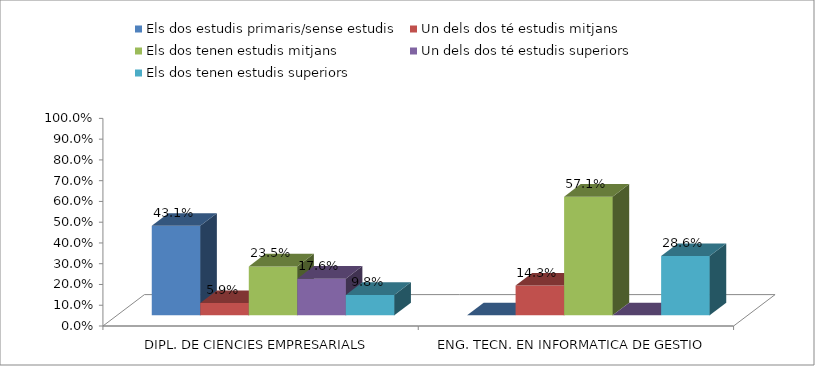
| Category | Els dos estudis primaris/sense estudis | Un dels dos té estudis mitjans | Els dos tenen estudis mitjans | Un dels dos té estudis superiors | Els dos tenen estudis superiors |
|---|---|---|---|---|---|
| DIPL. DE CIENCIES EMPRESARIALS | 0.431 | 0.059 | 0.235 | 0.176 | 0.098 |
| ENG. TECN. EN INFORMATICA DE GESTIO | 0 | 0.143 | 0.571 | 0 | 0.286 |